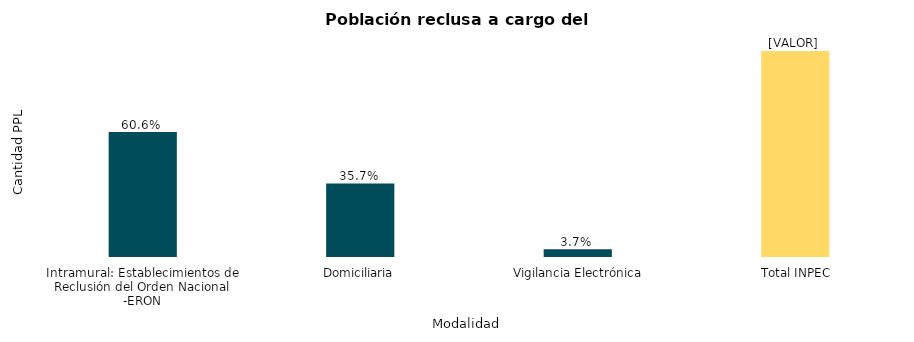
| Category | Total PPL |
|---|---|
| Intramural: Establecimientos de Reclusión del Orden Nacional -ERON | 102220 |
| Domiciliaria | 60176 |
|  Vigilancia Electrónica | 6245 |
|  Total INPEC | 168641 |